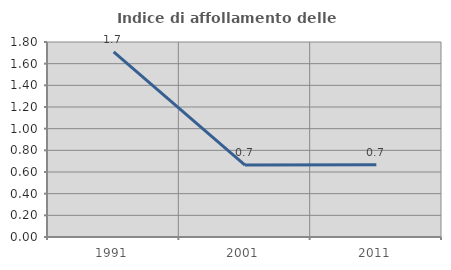
| Category | Indice di affollamento delle abitazioni  |
|---|---|
| 1991.0 | 1.709 |
| 2001.0 | 0.664 |
| 2011.0 | 0.667 |